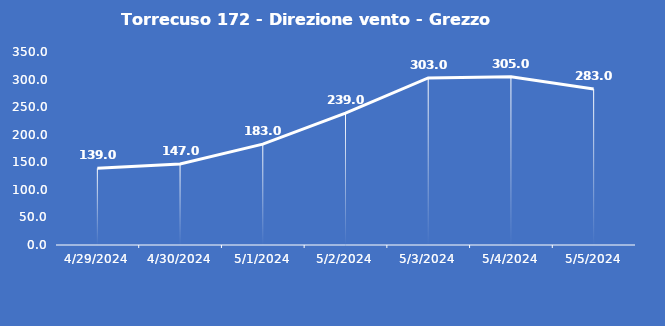
| Category | Torrecuso 172 - Direzione vento - Grezzo (°N) |
|---|---|
| 4/29/24 | 139 |
| 4/30/24 | 147 |
| 5/1/24 | 183 |
| 5/2/24 | 239 |
| 5/3/24 | 303 |
| 5/4/24 | 305 |
| 5/5/24 | 283 |